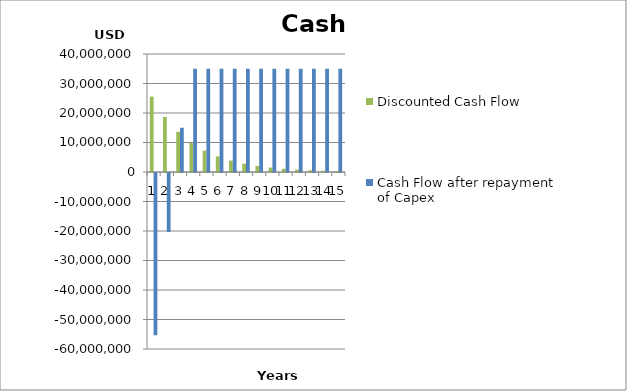
| Category | Discounted Cash Flow | Cash Flow after repayment of Capex |
|---|---|---|
| 0 | 25547445.255 | -55000000 |
| 1 | 18647770.259 | -20000000 |
| 2 | 13611511.138 | 15000000 |
| 3 | 9935409.59 | 35000000 |
| 4 | 7252123.788 | 35000000 |
| 5 | 5293521.013 | 35000000 |
| 6 | 3863883.951 | 35000000 |
| 7 | 2820353.249 | 35000000 |
| 8 | 2058652.007 | 35000000 |
| 9 | 1502665.698 | 35000000 |
| 10 | 1096836.276 | 35000000 |
| 11 | 800610.421 | 35000000 |
| 12 | 584387.168 | 35000000 |
| 13 | 426559.977 | 35000000 |
| 14 | 311357.647 | 35000000 |